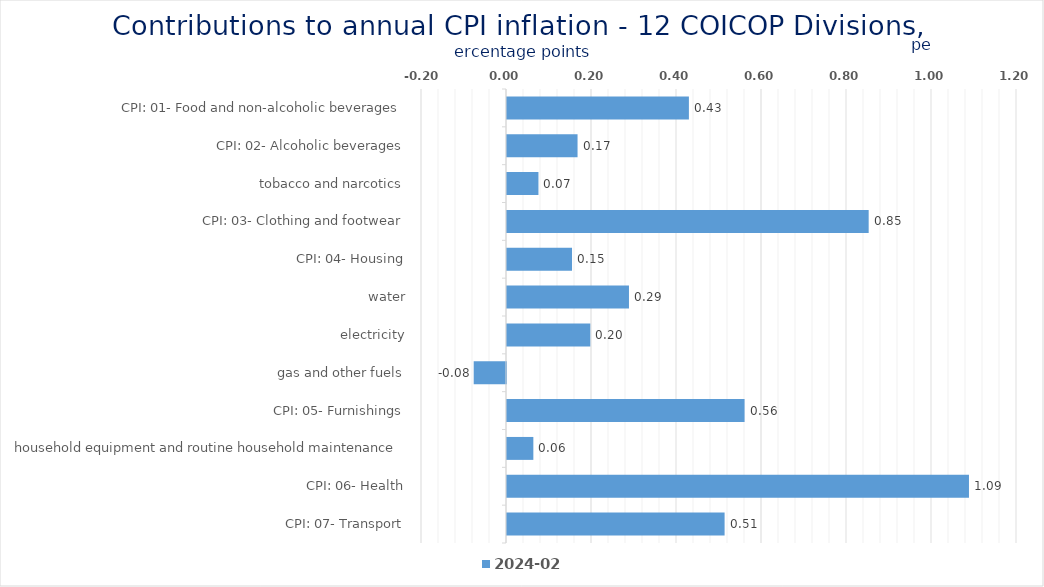
| Category | 2024-02 |
|---|---|
| CPI: 01- Food and non-alcoholic beverages | 0.428 |
| CPI: 02- Alcoholic beverages, tobacco and narcotics | 0.166 |
| CPI: 03- Clothing and footwear | 0.074 |
| CPI: 04- Housing, water, electricity, gas and other fuels | 0.851 |
| CPI: 05- Furnishings, household equipment and routine household maintenance | 0.153 |
| CPI: 06- Health | 0.287 |
| CPI: 07- Transport | 0.196 |
| CPI: 08- Communication | -0.076 |
| CPI: 09- Recreation and culture | 0.559 |
| CPI: 10- Education | 0.062 |
| CPI: 11- Restaurants and hotels | 1.087 |
| CPI: 12- Miscellaneous goods and services | 0.512 |